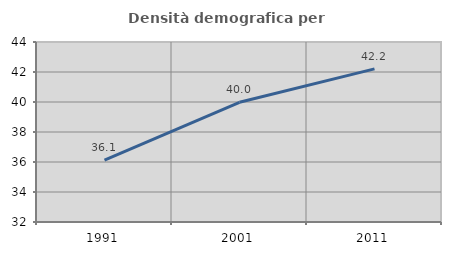
| Category | Densità demografica |
|---|---|
| 1991.0 | 36.121 |
| 2001.0 | 39.983 |
| 2011.0 | 42.209 |